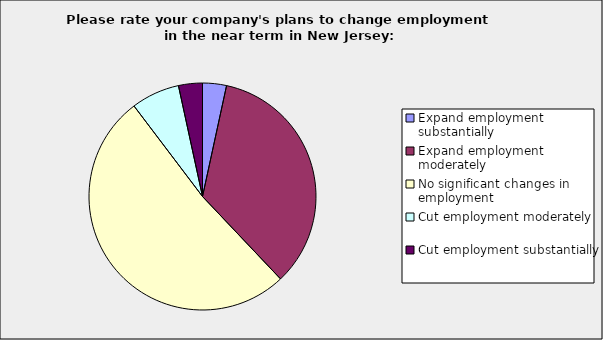
| Category | Series 0 |
|---|---|
| Expand employment substantially | 0.034 |
| Expand employment moderately | 0.345 |
| No significant changes in employment | 0.517 |
| Cut employment moderately | 0.069 |
| Cut employment substantially | 0.034 |